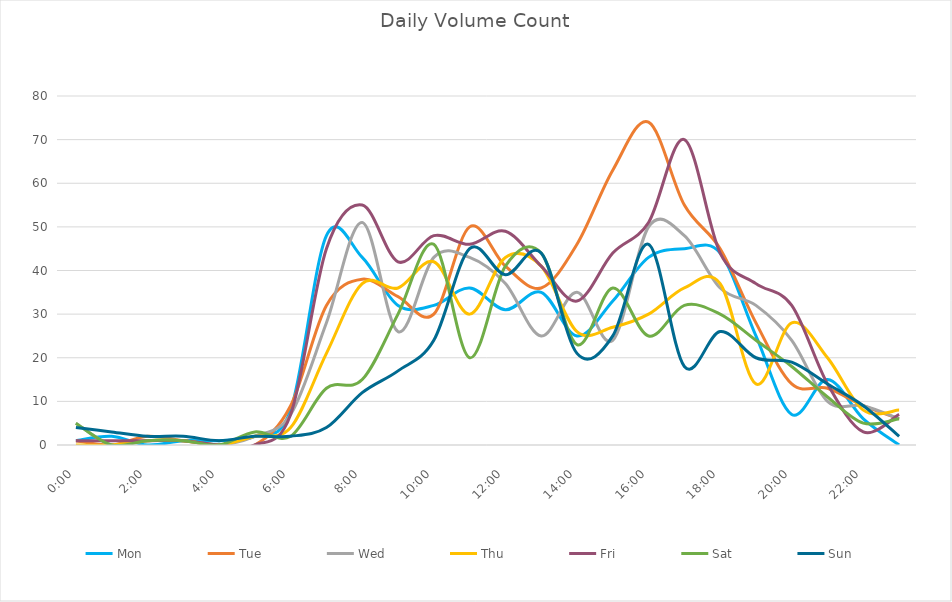
| Category | Mon | Tue | Wed | Thu | Fri | Sat | Sun |
|---|---|---|---|---|---|---|---|
| 0.0 | 1 | 1 | 5 | 0 | 1 | 5 | 4 |
| 0.0416666666666667 | 2 | 0 | 0 | 0 | 1 | 0 | 3 |
| 0.0833333333333333 | 0 | 2 | 1 | 1 | 1 | 1 | 2 |
| 0.125 | 1 | 1 | 1 | 1 | 1 | 1 | 2 |
| 0.166666666666667 | 1 | 0 | 0 | 0 | 0 | 0 | 1 |
| 0.208333333333333 | 2 | 0 | 2 | 2 | 0 | 3 | 2 |
| 0.25 | 8 | 9 | 7 | 4 | 7 | 2 | 2 |
| 0.291666666666667 | 48 | 32 | 28 | 21 | 45 | 13 | 4 |
| 0.333333333333333 | 43 | 38 | 51 | 37 | 55 | 15 | 12 |
| 0.375 | 32 | 34 | 26 | 36 | 42 | 30 | 17 |
| 0.416666666666667 | 32 | 30 | 43 | 42 | 48 | 46 | 24 |
| 0.4583333333333333 | 36 | 50 | 43 | 30 | 46 | 20 | 45 |
| 0.5 | 31 | 41 | 37 | 43 | 49 | 41 | 39 |
| 0.541666666666667 | 35 | 36 | 25 | 41 | 41 | 44 | 44 |
| 0.5833333333333334 | 25 | 46 | 35 | 26 | 33 | 23 | 21 |
| 0.625 | 33 | 63 | 24 | 27 | 44 | 36 | 25 |
| 0.666666666666667 | 43 | 74 | 50 | 30 | 51 | 25 | 46 |
| 0.7083333333333334 | 45 | 55 | 48 | 36 | 70 | 32 | 18 |
| 0.75 | 44 | 45 | 36 | 37 | 44 | 30 | 26 |
| 0.791666666666667 | 25 | 28 | 32 | 14 | 37 | 24 | 20 |
| 0.8333333333333334 | 7 | 14 | 24 | 28 | 32 | 18 | 19 |
| 0.875 | 15 | 13 | 10 | 20 | 14 | 11 | 14 |
| 0.916666666666667 | 6 | 9 | 9 | 8 | 3 | 5 | 9 |
| 0.9583333333333334 | 0 | 6 | 6 | 8 | 7 | 6 | 2 |